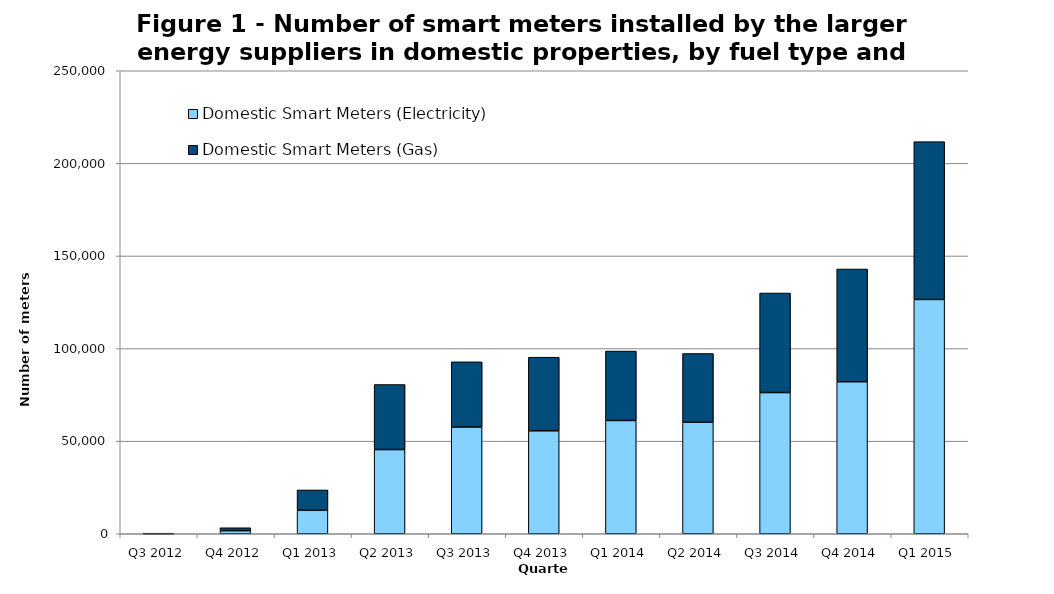
| Category | Domestic Smart Meters (Electricity) | Domestic Smart Meters (Gas) |
|---|---|---|
| Q3 2012 | 36 | 32 |
| Q4 2012 | 1671 | 1570 |
| Q1 2013 | 12678 | 10963 |
| Q2 2013 | 45456 | 35130 |
| Q3 2013 | 57632 | 35190 |
| Q4 2013 | 55603 | 39730 |
| Q1 2014 | 61164 | 37480 |
| Q2 2014 | 60216 | 37113 |
| Q3 2014 | 76227 | 53764 |
| Q4 2014 | 82081 | 60882 |
| Q1 2015 | 126515 | 85202 |